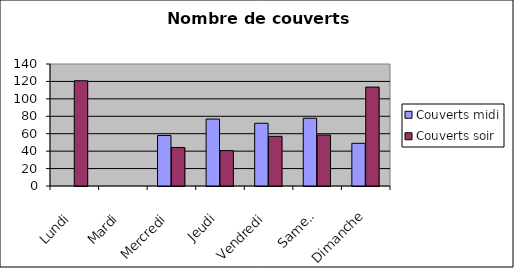
| Category | Couverts |
|---|---|
| Lundi | 120.75 |
| Mardi | 0 |
| Mercredi | 44.2 |
| Jeudi | 40.6 |
| Vendredi | 57 |
| Samedi | 58.5 |
| Dimanche | 113.5 |